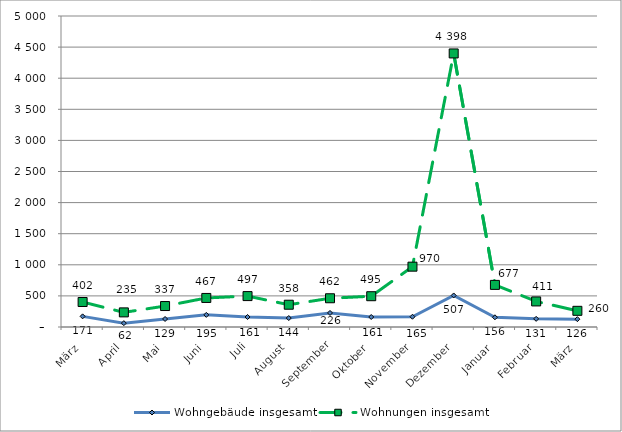
| Category | Wohngebäude insgesamt | Wohnungen insgesamt |
|---|---|---|
| März | 171 | 402 |
| April | 62 | 235 |
| Mai | 129 | 337 |
| Juni | 195 | 467 |
| Juli | 161 | 497 |
| August | 144 | 358 |
| September | 226 | 462 |
| Oktober | 161 | 495 |
| November | 165 | 970 |
| Dezember | 507 | 4398 |
| Januar | 156 | 677 |
| Februar | 131 | 411 |
| März | 126 | 260 |